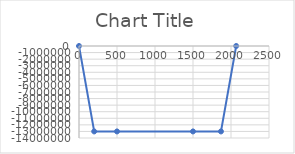
| Category | Series 0 |
|---|---|
| 0.0 | 0 |
| 200.0 | -13000000 |
| 500.0 | -13000000 |
| 1500.0 | -13000000 |
| 1868.0 | -13000000 |
| 2068.0 | 0 |